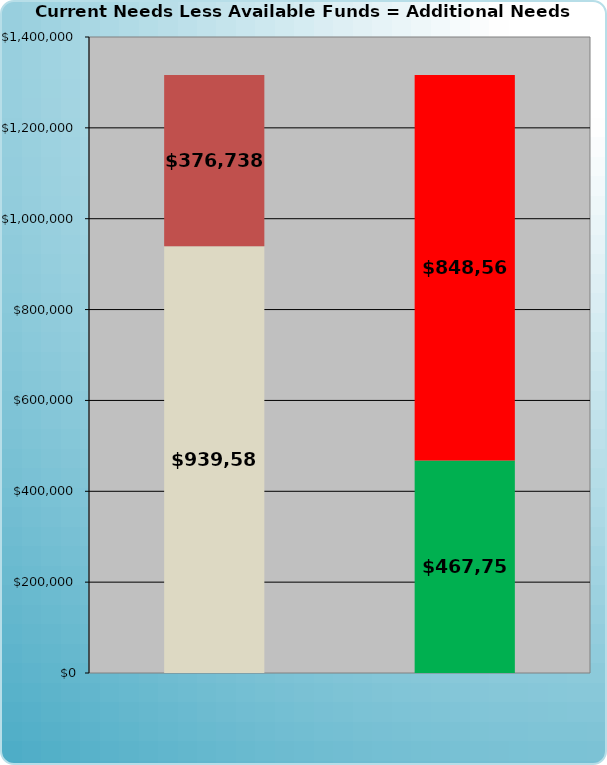
| Category | Series 0 | Series 1 |
|---|---|---|
| 0 | 939583.285 | 376738.288 |
| 1 | 467755 | 848566.574 |